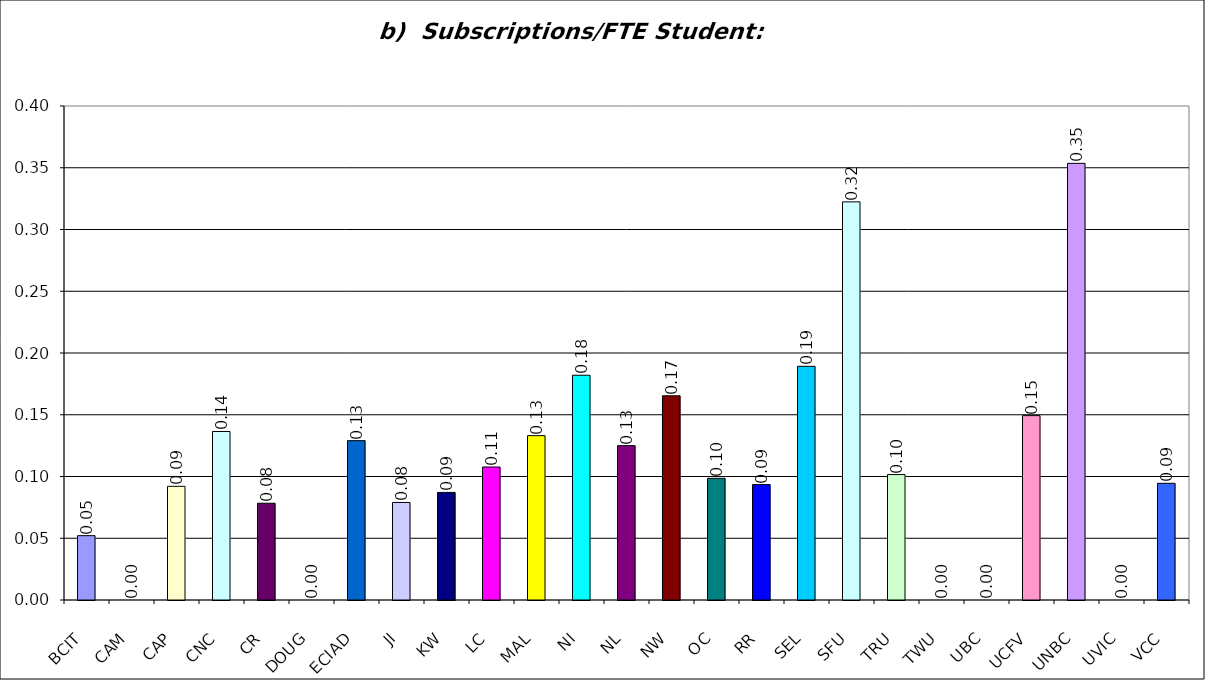
| Category | b)  Subscriptions/FTE Student:  5(g)/3(a) |
|---|---|
| BCIT | 0.052 |
| CAM | 0 |
| CAP | 0.092 |
| CNC | 0.136 |
| CR | 0.078 |
| DOUG | 0 |
| ECIAD | 0.129 |
| JI | 0.079 |
| KW | 0.087 |
| LC | 0.108 |
| MAL | 0.133 |
| NI | 0.182 |
| NL | 0.125 |
| NW | 0.165 |
| OC | 0.099 |
| RR | 0.093 |
| SEL | 0.189 |
| SFU | 0.322 |
| TRU | 0.102 |
| TWU | 0 |
| UBC | 0 |
| UCFV | 0.149 |
| UNBC | 0.354 |
| UVIC | 0 |
| VCC | 0.094 |